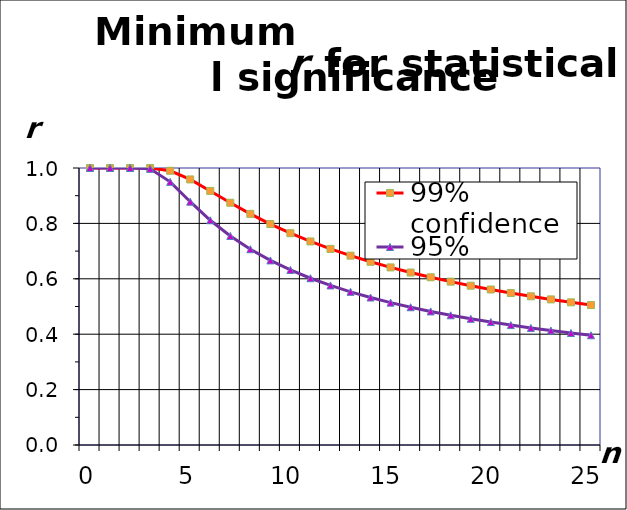
| Category | 99% confidence | 95% confidence |
|---|---|---|
| 0.0 | 1 | 1 |
| 1.0 | 1 | 1 |
| 2.0 | 1 | 1 |
| 3.0 | 1 | 0.997 |
| 4.0 | 0.99 | 0.95 |
| 5.0 | 0.959 | 0.878 |
| 6.0 | 0.917 | 0.811 |
| 7.0 | 0.875 | 0.754 |
| 8.0 | 0.834 | 0.707 |
| 9.0 | 0.798 | 0.666 |
| 10.0 | 0.765 | 0.632 |
| 11.0 | 0.735 | 0.602 |
| 12.0 | 0.708 | 0.576 |
| 13.0 | 0.684 | 0.553 |
| 14.0 | 0.661 | 0.532 |
| 15.0 | 0.641 | 0.514 |
| 16.0 | 0.623 | 0.497 |
| 17.0 | 0.606 | 0.482 |
| 18.0 | 0.59 | 0.468 |
| 19.0 | 0.575 | 0.456 |
| 20.0 | 0.561 | 0.444 |
| 21.0 | 0.549 | 0.433 |
| 22.0 | 0.537 | 0.423 |
| 23.0 | 0.526 | 0.413 |
| 24.0 | 0.515 | 0.404 |
| 25.0 | 0.505 | 0.396 |